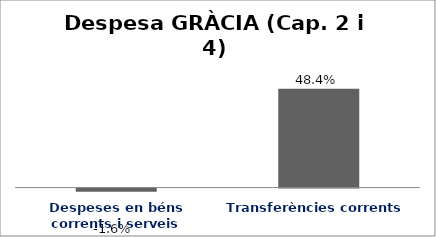
| Category | Series 0 |
|---|---|
| Despeses en béns corrents i serveis | -0.016 |
| Transferències corrents | 0.484 |